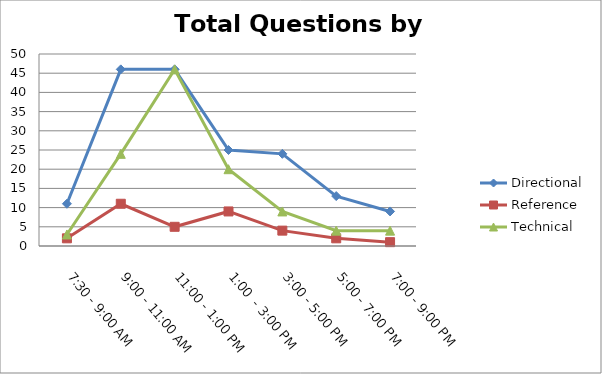
| Category | Directional | Reference | Technical |
|---|---|---|---|
| 7:30 - 9:00 AM | 11 | 2 | 3 |
| 9:00 - 11:00 AM | 46 | 11 | 24 |
| 11:00 - 1:00 PM | 46 | 5 | 46 |
| 1:00  - 3:00 PM | 25 | 9 | 20 |
| 3:00 - 5:00 PM | 24 | 4 | 9 |
| 5:00 - 7:00 PM | 13 | 2 | 4 |
| 7:00 - 9:00 PM | 9 | 1 | 4 |